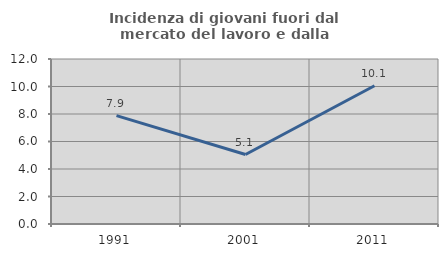
| Category | Incidenza di giovani fuori dal mercato del lavoro e dalla formazione  |
|---|---|
| 1991.0 | 7.877 |
| 2001.0 | 5.053 |
| 2011.0 | 10.054 |